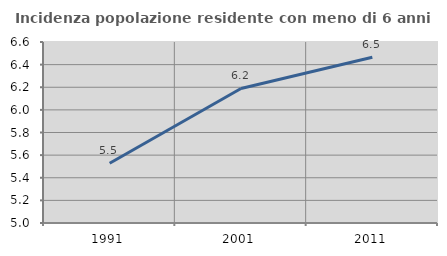
| Category | Incidenza popolazione residente con meno di 6 anni |
|---|---|
| 1991.0 | 5.529 |
| 2001.0 | 6.189 |
| 2011.0 | 6.465 |